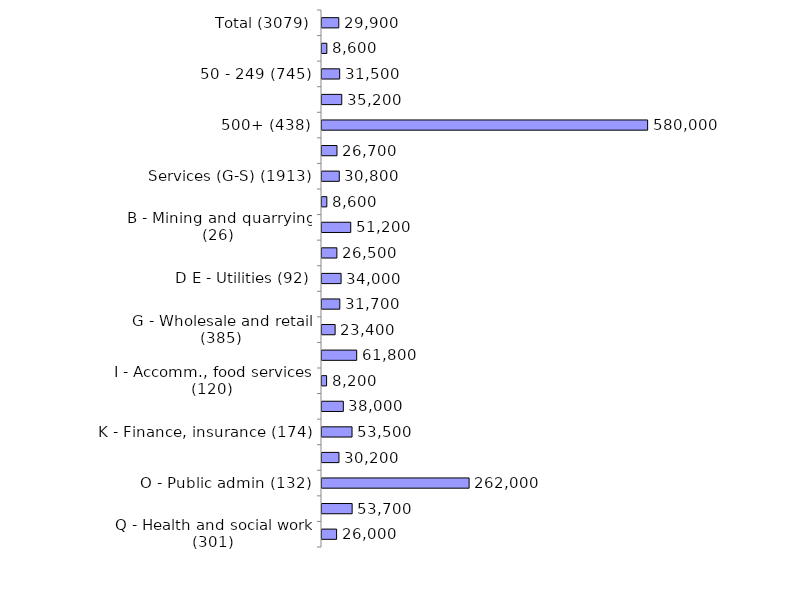
| Category | Series 0 |
|---|---|
| Total (3079) | 29900 |
| 10-49 (1580) | 8600 |
| 50 - 249 (745) | 31500 |
| 250 - 499 (316) | 35200 |
| 500+ (438) | 580000 |
| Production (A-F) (1166) | 26700 |
| Services (G-S) (1913) | 30800 |
| A - Agriculture (92) | 8600 |
| B - Mining and quarrying (26) | 51200 |
| C - Manufacturing (834) | 26500 |
| D E - Utilities (92) | 34000 |
| F - Construction (122) | 31700 |
| G - Wholesale and retail (385) | 23400 |
| H - Transport, storage (134) | 61800 |
| I - Accomm., food services (120) | 8200 |
| J - Information, comms (101) | 38000 |
| K - Finance, insurance (174) | 53500 |
| LMNRS - Bus/tech/admin/arts/other (259) | 30200 |
| O - Public admin (132) | 262000 |
| P - Education (307) | 53700 |
| Q - Health and social work (301) | 26000 |